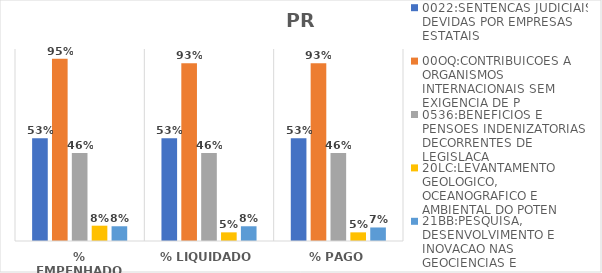
| Category | 0022:SENTENCAS JUDICIAIS DEVIDAS POR EMPRESAS ESTATAIS | 00OQ:CONTRIBUICOES A ORGANISMOS INTERNACIONAIS SEM EXIGENCIA DE P | 0536:BENEFICIOS E PENSOES INDENIZATORIAS DECORRENTES DE LEGISLACA | 20LC:LEVANTAMENTO GEOLOGICO, OCEANOGRAFICO E AMBIENTAL DO POTEN | 21BB:PESQUISA, DESENVOLVIMENTO E INOVACAO NAS GEOCIENCIAS E |
|---|---|---|---|---|---|
| % EMPENHADO | 0.535 | 0.95 | 0.459 | 0.08 | 0.077 |
| % LIQUIDADO | 0.535 | 0.926 | 0.459 | 0.045 | 0.077 |
| % PAGO | 0.535 | 0.926 | 0.459 | 0.045 | 0.07 |